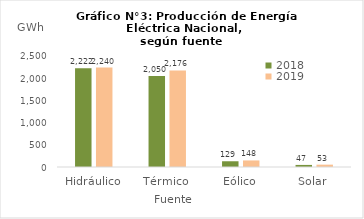
| Category | 2018 | 2019 |
|---|---|---|
| Hidráulico | 2222.399 | 2239.733 |
| Térmico | 2050.333 | 2175.536 |
| Eólico | 129.267 | 147.885 |
| Solar | 46.716 | 52.872 |